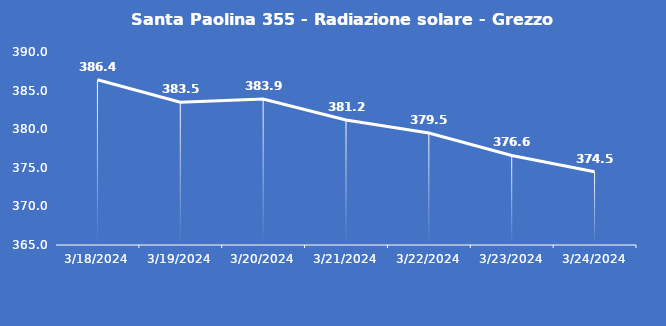
| Category | Santa Paolina 355 - Radiazione solare - Grezzo (W/m2) |
|---|---|
| 3/18/24 | 386.4 |
| 3/19/24 | 383.5 |
| 3/20/24 | 383.9 |
| 3/21/24 | 381.2 |
| 3/22/24 | 379.5 |
| 3/23/24 | 376.6 |
| 3/24/24 | 374.5 |